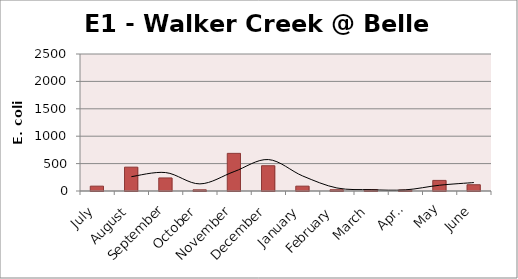
| Category | E. coli MPN |
|---|---|
| July | 88.6 |
| August | 435.2 |
| September | 238.2 |
| October | 21.6 |
| November | 686.7 |
| December | 461.1 |
| January | 88.4 |
| February | 22.8 |
| March | 24.3 |
| April | 17.3 |
| May | 193.5 |
| June | 114.5 |